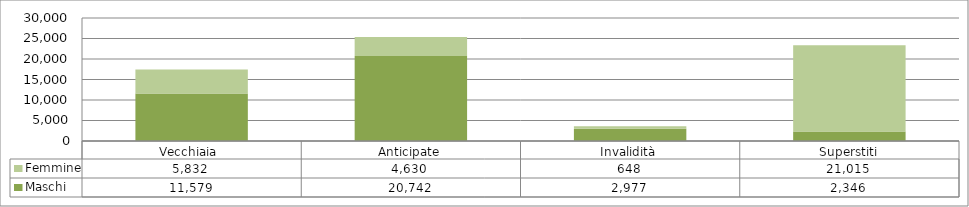
| Category | Maschi | Femmine |
|---|---|---|
| Vecchiaia  | 11579 | 5832 |
| Anticipate | 20742 | 4630 |
| Invalidità | 2977 | 648 |
| Superstiti | 2346 | 21015 |